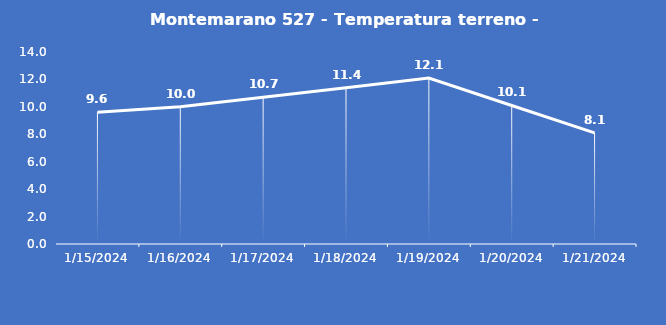
| Category | Montemarano 527 - Temperatura terreno - Grezzo (°C) |
|---|---|
| 1/15/24 | 9.6 |
| 1/16/24 | 10 |
| 1/17/24 | 10.7 |
| 1/18/24 | 11.4 |
| 1/19/24 | 12.1 |
| 1/20/24 | 10.1 |
| 1/21/24 | 8.1 |